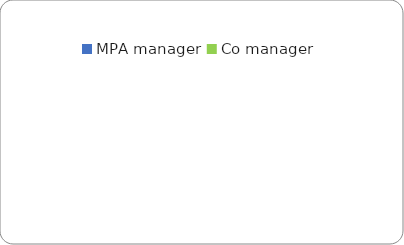
| Category | Series 0 |
|---|---|
| MPA manager  | 0 |
| Co manager  | 0 |